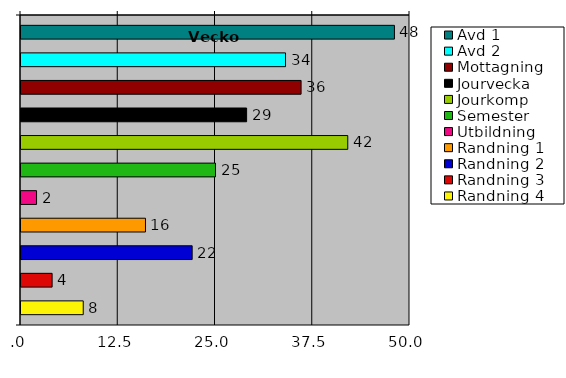
| Category | Avd 1 | Avd 2 | Mottagning | Jourvecka | Jourkomp | Semester | Utbildning | Randning 1 | Randning 2 | Randning 3 | Randning 4 |
|---|---|---|---|---|---|---|---|---|---|---|---|
| 0 | 48 | 34 | 36 | 29 | 42 | 25 | 2 | 16 | 22 | 4 | 8 |